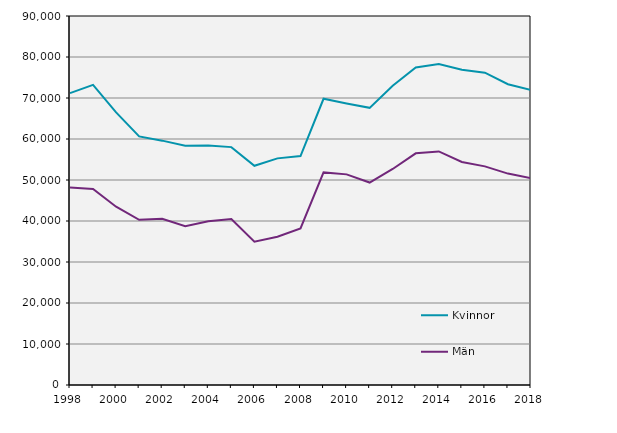
| Category | Kvinnor | Män |
|---|---|---|
| 1998.0 | 71201 | 48192 |
| 1999.0 | 73194 | 47789 |
| 2000.0 | 66491 | 43495 |
| 2001.0 | 60639 | 40301 |
| 2002.0 | 59598 | 40532 |
| 2003.0 | 58330 | 38727 |
| 2004.0 | 58434 | 39957 |
| 2005.0 | 58019 | 40481 |
| 2006.0 | 53471 | 34944 |
| 2007.0 | 55277 | 36155 |
| 2008.0 | 55847 | 38199 |
| 2009.0 | 69814 | 51848 |
| 2010.0 | 68674 | 51375 |
| 2011.0 | 67596 | 49376 |
| 2012.0 | 72998 | 52689 |
| 2013.0 | 77428 | 56510 |
| 2014.0 | 78294 | 56964 |
| 2015.0 | 76874 | 54394 |
| 2016.0 | 76183 | 53326 |
| 2017.0 | 73362 | 51564 |
| 2018.0 | 71948 | 50424 |